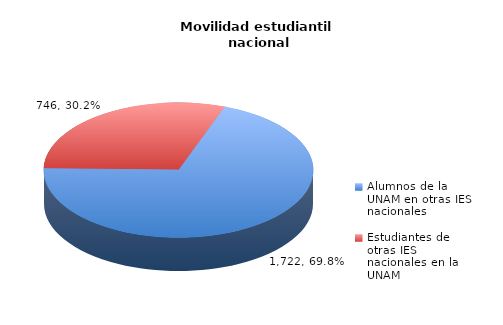
| Category | Series 0 |
|---|---|
| Alumnos de la UNAM en otras IES nacionales | 1722 |
| Estudiantes de otras IES nacionales en la UNAM | 746 |